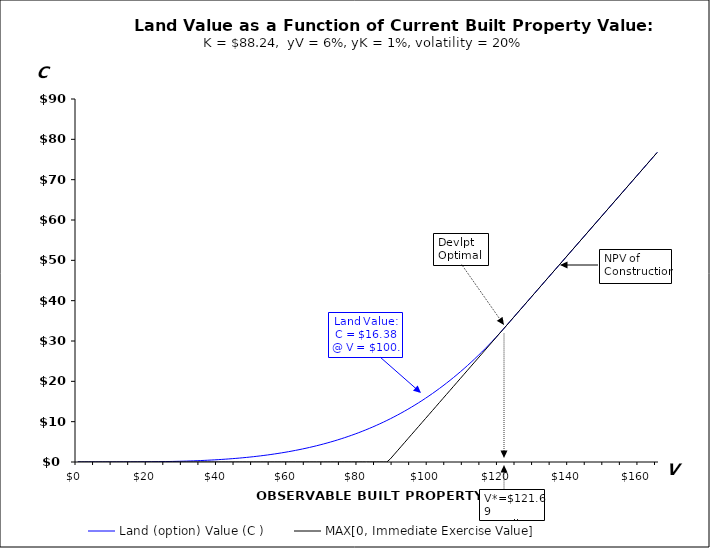
| Category | Land (option) Value (C ) | MAX[0, Immediate Exercise Value] |
|---|---|---|
| 0.0 | 0 | 0 |
| 1.0 | 0 | 0 |
| 2.0 | 0 | 0 |
| 3.0 | 0 | 0 |
| 4.0 | 0 | 0 |
| 5.0 | 0 | 0 |
| 6.0 | 0.001 | 0 |
| 7.0 | 0.001 | 0 |
| 8.0 | 0.002 | 0 |
| 9.0 | 0.003 | 0 |
| 10.0 | 0.004 | 0 |
| 11.0 | 0.005 | 0 |
| 12.0 | 0.007 | 0 |
| 13.0 | 0.01 | 0 |
| 14.0 | 0.013 | 0 |
| 15.0 | 0.016 | 0 |
| 16.0 | 0.021 | 0 |
| 17.0 | 0.026 | 0 |
| 18.0 | 0.032 | 0 |
| 19.0 | 0.039 | 0 |
| 20.0 | 0.047 | 0 |
| 21.0 | 0.056 | 0 |
| 22.0 | 0.066 | 0 |
| 23.0 | 0.078 | 0 |
| 24.0 | 0.091 | 0 |
| 25.0 | 0.106 | 0 |
| 26.0 | 0.122 | 0 |
| 27.0 | 0.14 | 0 |
| 28.0 | 0.16 | 0 |
| 29.0 | 0.181 | 0 |
| 30.0 | 0.205 | 0 |
| 31.0 | 0.231 | 0 |
| 32.0 | 0.26 | 0 |
| 33.0 | 0.29 | 0 |
| 34.0 | 0.324 | 0 |
| 35.0 | 0.36 | 0 |
| 36.0 | 0.398 | 0 |
| 37.0 | 0.44 | 0 |
| 38.0 | 0.485 | 0 |
| 39.0 | 0.533 | 0 |
| 40.0 | 0.585 | 0 |
| 41.0 | 0.64 | 0 |
| 42.0 | 0.698 | 0 |
| 43.0 | 0.761 | 0 |
| 44.0 | 0.827 | 0 |
| 45.0 | 0.897 | 0 |
| 46.0 | 0.972 | 0 |
| 47.0 | 1.051 | 0 |
| 48.0 | 1.135 | 0 |
| 49.0 | 1.223 | 0 |
| 50.0 | 1.316 | 0 |
| 51.0 | 1.415 | 0 |
| 52.0 | 1.518 | 0 |
| 53.0 | 1.627 | 0 |
| 54.0 | 1.742 | 0 |
| 55.0 | 1.862 | 0 |
| 56.0 | 1.988 | 0 |
| 57.0 | 2.12 | 0 |
| 58.0 | 2.259 | 0 |
| 59.0 | 2.403 | 0 |
| 60.0 | 2.555 | 0 |
| 61.0 | 2.713 | 0 |
| 62.0 | 2.879 | 0 |
| 63.0 | 3.051 | 0 |
| 64.0 | 3.231 | 0 |
| 65.0 | 3.418 | 0 |
| 66.0 | 3.614 | 0 |
| 67.0 | 3.817 | 0 |
| 68.0 | 4.028 | 0 |
| 69.0 | 4.248 | 0 |
| 70.0 | 4.476 | 0 |
| 71.0 | 4.713 | 0 |
| 72.0 | 4.959 | 0 |
| 73.0 | 5.214 | 0 |
| 74.0 | 5.479 | 0 |
| 75.0 | 5.753 | 0 |
| 76.0 | 6.037 | 0 |
| 77.0 | 6.331 | 0 |
| 78.0 | 6.635 | 0 |
| 79.0 | 6.95 | 0 |
| 80.0 | 7.275 | 0 |
| 81.0 | 7.611 | 0 |
| 82.0 | 7.959 | 0 |
| 83.0 | 8.318 | 0 |
| 84.0 | 8.688 | 0 |
| 85.0 | 9.07 | 0 |
| 86.0 | 9.464 | 0 |
| 87.0 | 9.871 | 0 |
| 88.0 | 10.29 | 0 |
| 89.0 | 10.721 | 0.765 |
| 90.0 | 11.166 | 1.765 |
| 91.0 | 11.624 | 2.765 |
| 92.0 | 12.096 | 3.765 |
| 93.0 | 12.581 | 4.765 |
| 94.0 | 13.08 | 5.765 |
| 95.0 | 13.593 | 6.765 |
| 96.0 | 14.121 | 7.765 |
| 97.0 | 14.663 | 8.765 |
| 98.0 | 15.221 | 9.765 |
| 99.0 | 15.793 | 10.765 |
| 100.0 | 16.381 | 11.765 |
| 101.0 | 16.985 | 12.765 |
| 102.0 | 17.605 | 13.765 |
| 103.0 | 18.241 | 14.765 |
| 104.0 | 18.893 | 15.765 |
| 105.0 | 19.562 | 16.765 |
| 106.0 | 20.249 | 17.765 |
| 107.0 | 20.952 | 18.765 |
| 108.0 | 21.673 | 19.765 |
| 109.0 | 22.412 | 20.765 |
| 110.0 | 23.169 | 21.765 |
| 111.0 | 23.945 | 22.765 |
| 112.0 | 24.739 | 23.765 |
| 113.0 | 25.552 | 24.765 |
| 114.0 | 26.384 | 25.765 |
| 115.0 | 27.235 | 26.765 |
| 116.0 | 28.107 | 27.765 |
| 117.0 | 28.998 | 28.765 |
| 118.0 | 29.91 | 29.765 |
| 119.0 | 30.842 | 30.765 |
| 120.0 | 31.795 | 31.765 |
| 121.0 | 32.77 | 32.765 |
| 122.0 | 33.765 | 33.765 |
| 123.0 | 34.765 | 34.765 |
| 124.0 | 35.765 | 35.765 |
| 125.0 | 36.765 | 36.765 |
| 126.0 | 37.765 | 37.765 |
| 127.0 | 38.765 | 38.765 |
| 128.0 | 39.765 | 39.765 |
| 129.0 | 40.765 | 40.765 |
| 130.0 | 41.765 | 41.765 |
| 131.0 | 42.765 | 42.765 |
| 132.0 | 43.765 | 43.765 |
| 133.0 | 44.765 | 44.765 |
| 134.0 | 45.765 | 45.765 |
| 135.0 | 46.765 | 46.765 |
| 136.0 | 47.765 | 47.765 |
| 137.0 | 48.765 | 48.765 |
| 138.0 | 49.765 | 49.765 |
| 139.0 | 50.765 | 50.765 |
| 140.0 | 51.765 | 51.765 |
| 141.0 | 52.765 | 52.765 |
| 142.0 | 53.765 | 53.765 |
| 143.0 | 54.765 | 54.765 |
| 144.0 | 55.765 | 55.765 |
| 145.0 | 56.765 | 56.765 |
| 146.0 | 57.765 | 57.765 |
| 147.0 | 58.765 | 58.765 |
| 148.0 | 59.765 | 59.765 |
| 149.0 | 60.765 | 60.765 |
| 150.0 | 61.765 | 61.765 |
| 151.0 | 62.765 | 62.765 |
| 152.0 | 63.765 | 63.765 |
| 153.0 | 64.765 | 64.765 |
| 154.0 | 65.765 | 65.765 |
| 155.0 | 66.765 | 66.765 |
| 156.0 | 67.765 | 67.765 |
| 157.0 | 68.765 | 68.765 |
| 158.0 | 69.765 | 69.765 |
| 159.0 | 70.765 | 70.765 |
| 160.0 | 71.765 | 71.765 |
| 161.0 | 72.765 | 72.765 |
| 162.0 | 73.765 | 73.765 |
| 163.0 | 74.765 | 74.765 |
| 164.0 | 75.765 | 75.765 |
| 165.0 | 76.765 | 76.765 |